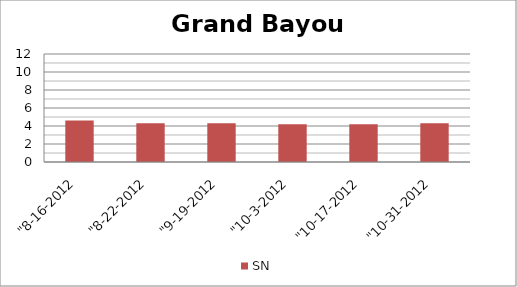
| Category | SN |
|---|---|
| "8-16-2012 | 4.6 |
| "8-22-2012 | 4.3 |
| "9-19-2012 | 4.3 |
| "10-3-2012 | 4.2 |
| "10-17-2012 | 4.2 |
| "10-31-2012 | 4.3 |